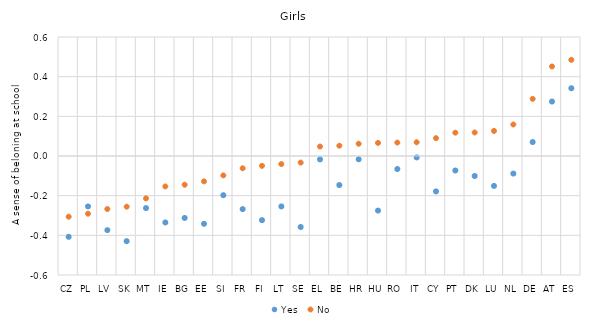
| Category | Yes | No |
|---|---|---|
| CZ | -0.408 | -0.306 |
| PL | -0.254 | -0.291 |
| LV | -0.374 | -0.267 |
| SK | -0.429 | -0.255 |
| MT | -0.262 | -0.214 |
| IE | -0.335 | -0.153 |
| BG | -0.312 | -0.145 |
| EE | -0.342 | -0.128 |
| SI | -0.197 | -0.098 |
| FR | -0.268 | -0.062 |
| FI | -0.323 | -0.05 |
| LT | -0.254 | -0.041 |
| SE | -0.358 | -0.033 |
| EL | -0.017 | 0.048 |
| BE | -0.147 | 0.052 |
| HR | -0.017 | 0.062 |
| HU | -0.275 | 0.066 |
| RO | -0.066 | 0.068 |
| IT | -0.007 | 0.069 |
| CY | -0.179 | 0.09 |
| PT | -0.073 | 0.118 |
| DK | -0.101 | 0.119 |
| LU | -0.151 | 0.126 |
| NL | -0.089 | 0.159 |
| DE | 0.07 | 0.288 |
| AT | 0.275 | 0.451 |
| ES | 0.342 | 0.485 |